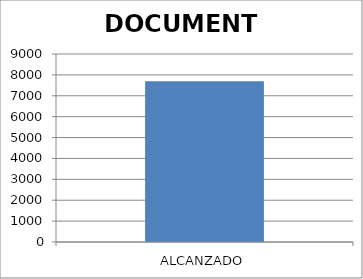
| Category | DOCUMENTO |
|---|---|
| ALCANZADO | 7698 |